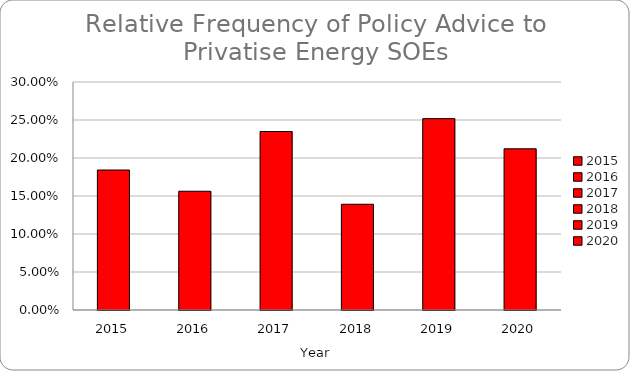
| Category | Privatise Energy SOE |
|---|---|
| 2015.0 | 0.184 |
| 2016.0 | 0.156 |
| 2017.0 | 0.235 |
| 2018.0 | 0.139 |
| 2019.0 | 0.252 |
| 2020.0 | 0.212 |